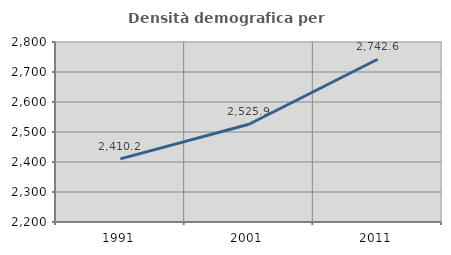
| Category | Densità demografica |
|---|---|
| 1991.0 | 2410.248 |
| 2001.0 | 2525.868 |
| 2011.0 | 2742.576 |